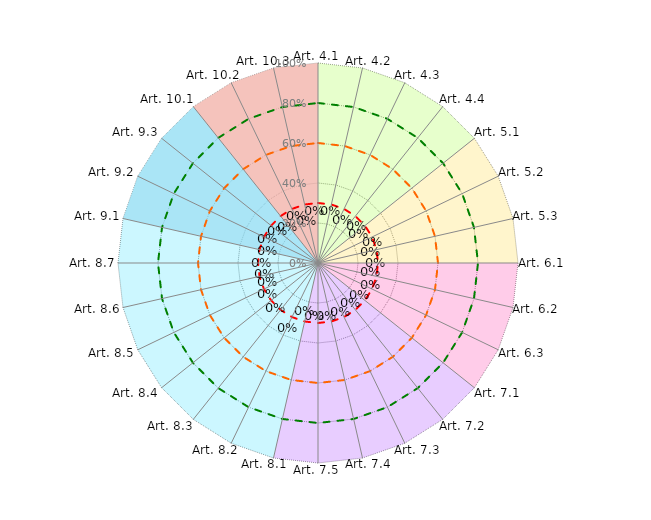
| Category | Coloriage Art 4 | Coloriage Art 5 | Coloriage Art  6 | Coloriage Art 7 | Coloriage Art 8 | Coloriage Art9 | Coloriage Art10 | Conforme | Convaincant | Informel | Résultat |
|---|---|---|---|---|---|---|---|---|---|---|---|
| Art. 4.1 | 1 | 0 | 0 | 0 | 0 | 0 | 1 | 0.8 | 0.6 | 0.3 | 0 |
| Art. 4.2 | 1 | 0 | 0 | 0 | 0 | 0 | 0 | 0.8 | 0.6 | 0.3 | 0 |
| Art. 4.3 | 1 | 0 | 0 | 0 | 0 | 0 | 0 | 0.8 | 0.6 | 0.3 | 0 |
| Art. 4.4 | 1 | 0 | 0 | 0 | 0 | 0 | 0 | 0.8 | 0.6 | 0.3 | 0 |
| Art. 5.1 | 1 | 1 | 0 | 0 | 0 | 0 | 0 | 0.8 | 0.6 | 0.3 | 0 |
| Art. 5.2 | 0 | 1 | 0 | 0 | 0 | 0 | 0 | 0.8 | 0.6 | 0.3 | 0 |
| Art. 5.3 | 0 | 1 | 0 | 0 | 0 | 0 | 0 | 0.8 | 0.6 | 0.3 | 0 |
| Art. 6.1 | 0 | 1 | 1 | 0 | 0 | 0 | 0 | 0.8 | 0.6 | 0.3 | 0 |
| Art. 6.2 | 0 | 0 | 1 | 0 | 0 | 0 | 0 | 0.8 | 0.6 | 0.3 | 0 |
| Art. 6.3 | 0 | 0 | 1 | 0 | 0 | 0 | 0 | 0.8 | 0.6 | 0.3 | 0 |
| Art. 7.1 | 0 | 0 | 1 | 1 | 0 | 0 | 0 | 0.8 | 0.6 | 0.3 | 0 |
| Art. 7.2 | 0 | 0 | 0 | 1 | 0 | 0 | 0 | 0.8 | 0.6 | 0.3 | 0 |
| Art. 7.3 | 0 | 0 | 0 | 1 | 0 | 0 | 0 | 0.8 | 0.6 | 0.3 | 0 |
| Art. 7.4 | 0 | 0 | 0 | 1 | 0 | 0 | 0 | 0.8 | 0.6 | 0.3 | 0 |
| Art. 7.5 | 0 | 0 | 0 | 1 | 0 | 0 | 0 | 0.8 | 0.6 | 0.3 | 0 |
| Art. 8.1 | 0 | 0 | 0 | 1 | 1 | 0 | 0 | 0.8 | 0.6 | 0.3 | 0 |
| Art. 8.2 | 0 | 0 | 0 | 0 | 1 | 0 | 0 | 0.8 | 0.6 | 0.3 | 0 |
| Art. 8.3 | 0 | 0 | 0 | 0 | 1 | 0 | 0 | 0.8 | 0.6 | 0.3 | 0 |
| Art. 8.4 | 0 | 0 | 0 | 0 | 1 | 0 | 0 | 0.8 | 0.6 | 0.3 | 0 |
| Art. 8.5 | 0 | 0 | 0 | 0 | 1 | 0 | 0 | 0.8 | 0.6 | 0.3 | 0 |
| Art. 8.6 | 0 | 0 | 0 | 0 | 1 | 0 | 0 | 0.8 | 0.6 | 0.3 | 0 |
| Art. 8.7 | 0 | 0 | 0 | 0 | 1 | 0 | 0 | 0.8 | 0.6 | 0.3 | 0 |
| Art. 9.1 | 0 | 0 | 0 | 0 | 1 | 1 | 0 | 0.8 | 0.6 | 0.3 | 0 |
| Art. 9.2 | 0 | 0 | 0 | 0 | 0 | 1 | 0 | 0.8 | 0.6 | 0.3 | 0 |
| Art. 9.3 | 0 | 0 | 0 | 0 | 0 | 1 | 0 | 0.8 | 0.6 | 0.3 | 0 |
| Art. 10.1 | 0 | 0 | 0 | 0 | 0 | 1 | 1 | 0.8 | 0.6 | 0.3 | 0 |
| Art. 10.2 | 0 | 0 | 0 | 0 | 0 | 0 | 1 | 0.8 | 0.6 | 0.3 | 0 |
| Art. 10.3 | 0 | 0 | 0 | 0 | 0 | 0 | 1 | 0.8 | 0.6 | 0.3 | 0 |